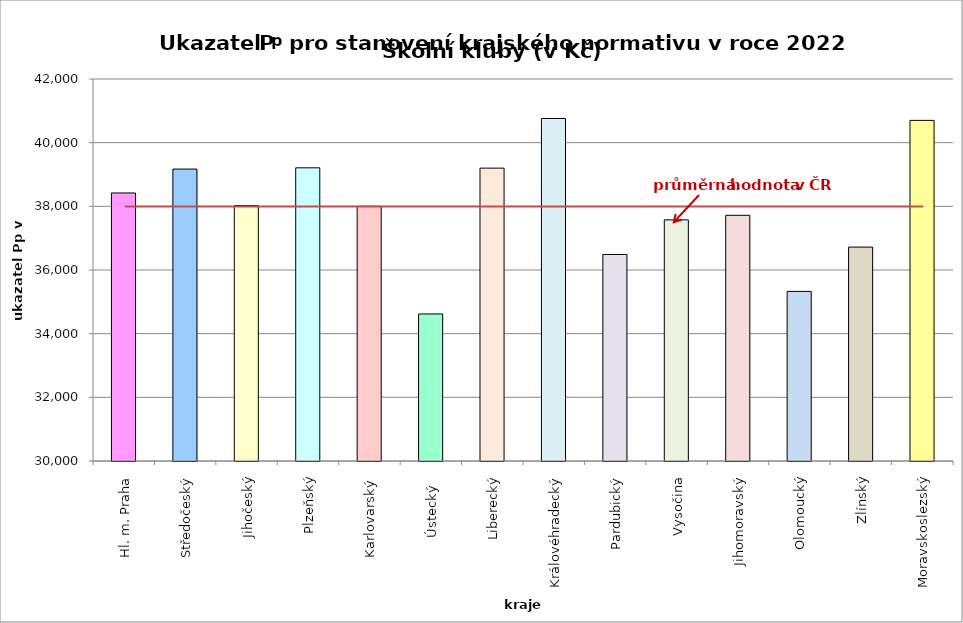
| Category | Series 0 |
|---|---|
| Hl. m. Praha | 38420 |
| Středočeský | 39171 |
| Jihočeský | 38025 |
| Plzeňský | 39210 |
| Karlovarský  | 38000 |
| Ústecký   | 34619 |
| Liberecký | 39200 |
| Královéhradecký | 40760 |
| Pardubický | 36488 |
| Vysočina | 37575 |
| Jihomoravský | 37718 |
| Olomoucký | 35328 |
| Zlínský | 36720 |
| Moravskoslezský | 40700 |